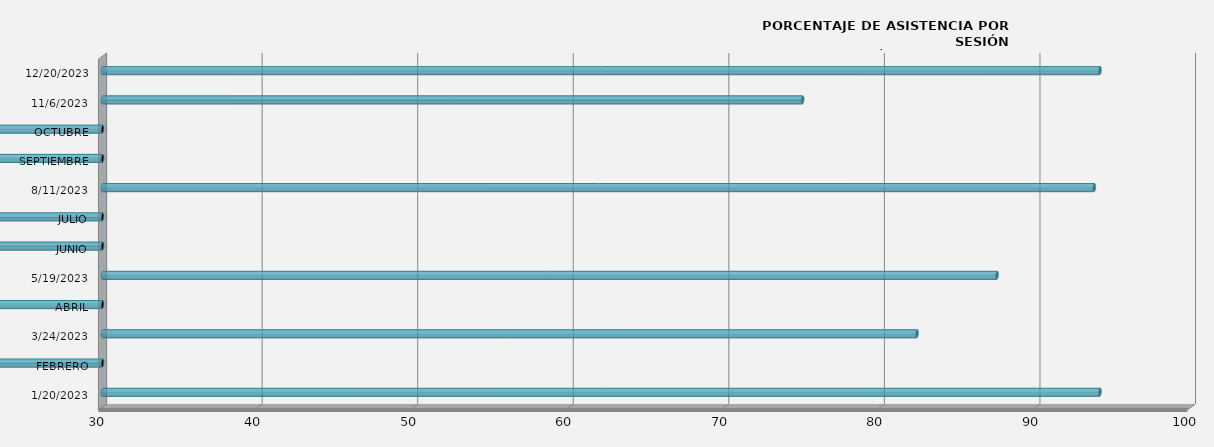
| Category | 20/01/2023 |
|---|---|
| 20/01/2023 | 94.118 |
| FEBRERO | 0 |
| 24/03/2023 | 82.353 |
| ABRIL | 0 |
| 19/05/2023 | 87.5 |
| JUNIO | 0 |
| JULIO | 0 |
| 11/08/2023 | 93.75 |
| SEPTIEMBRE | 0 |
| OCTUBRE | 0 |
| 06/11/2023 | 75 |
| 20/12/2023 | 94.118 |